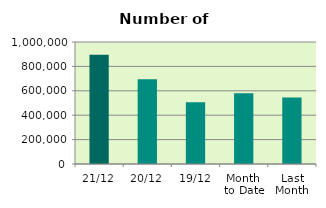
| Category | Series 0 |
|---|---|
| 21/12 | 895540 |
| 20/12 | 694562 |
| 19/12 | 506266 |
| Month 
to Date | 580705.333 |
| Last
Month | 544187.818 |